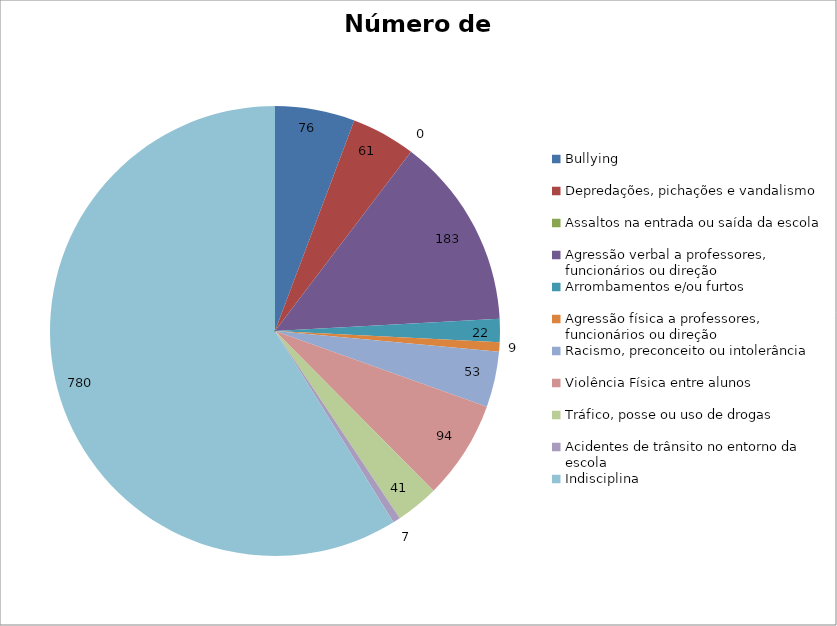
| Category | Número de Casos |
|---|---|
| Bullying | 76 |
| Depredações, pichações e vandalismo | 61 |
| Assaltos na entrada ou saída da escola | 0 |
| Agressão verbal a professores, funcionários ou direção | 183 |
| Arrombamentos e/ou furtos | 22 |
| Agressão física a professores, funcionários ou direção | 9 |
| Racismo, preconceito ou intolerância | 53 |
| Violência Física entre alunos | 94 |
| Tráfico, posse ou uso de drogas | 41 |
| Acidentes de trânsito no entorno da escola | 7 |
| Indisciplina | 780 |